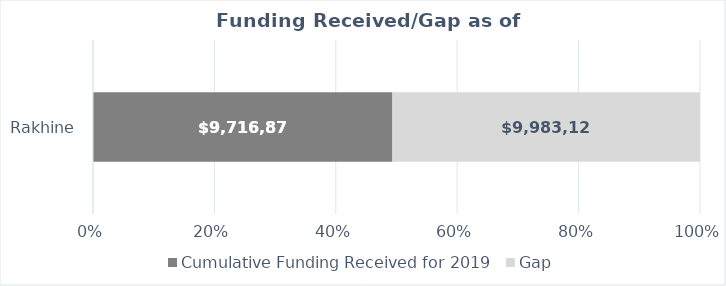
| Category | Cumulative Funding Received for 2019 | Gap |
|---|---|---|
| Rakhine | 9716875.031 | 9983124.969 |